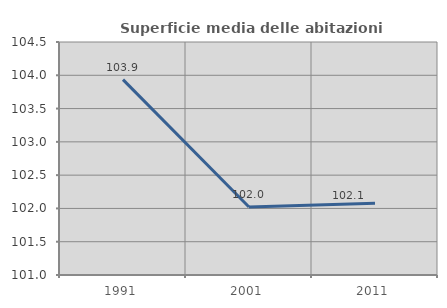
| Category | Superficie media delle abitazioni occupate |
|---|---|
| 1991.0 | 103.935 |
| 2001.0 | 102.021 |
| 2011.0 | 102.079 |